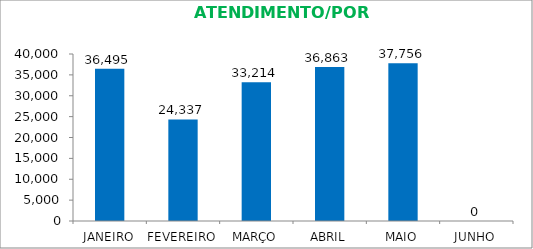
| Category | Series 0 |
|---|---|
| JANEIRO | 36495 |
| FEVEREIRO | 24337 |
| MARÇO | 33214 |
| ABRIL | 36863 |
| MAIO | 37756 |
| JUNHO | 0 |